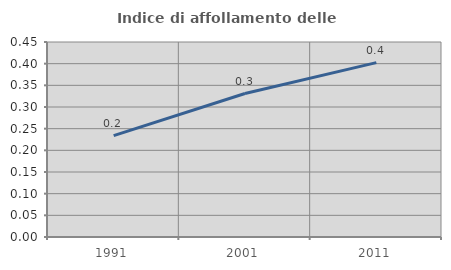
| Category | Indice di affollamento delle abitazioni  |
|---|---|
| 1991.0 | 0.234 |
| 2001.0 | 0.331 |
| 2011.0 | 0.402 |